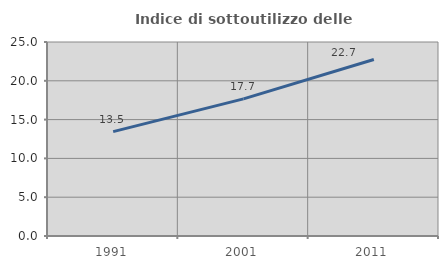
| Category | Indice di sottoutilizzo delle abitazioni  |
|---|---|
| 1991.0 | 13.451 |
| 2001.0 | 17.675 |
| 2011.0 | 22.739 |